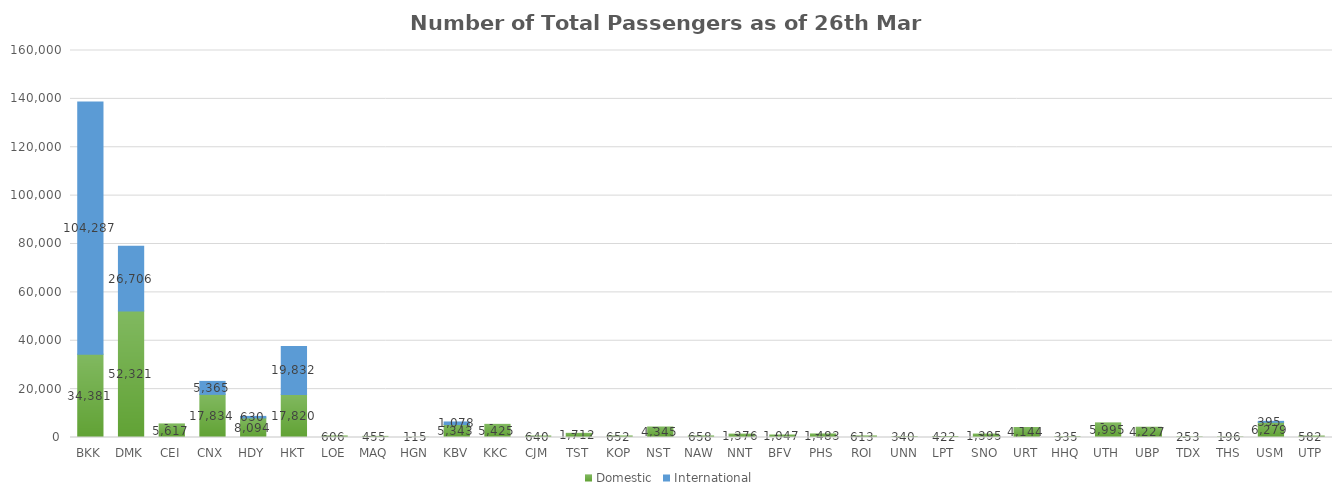
| Category | Domestic | International |
|---|---|---|
| BKK | 34381 | 104287 |
| DMK | 52321 | 26706 |
| CEI | 5617 | 0 |
| CNX | 17834 | 5365 |
| HDY | 8094 | 630 |
| HKT | 17820 | 19832 |
| LOE | 606 | 0 |
| MAQ | 455 | 0 |
| HGN | 115 | 0 |
| KBV | 5343 | 1078 |
| KKC | 5425 | 0 |
| CJM | 640 | 0 |
| TST | 1712 | 0 |
| KOP | 652 | 0 |
| NST | 4345 | 0 |
| NAW | 658 | 0 |
| NNT | 1376 | 0 |
| BFV | 1047 | 0 |
| PHS | 1483 | 0 |
| ROI | 613 | 0 |
| UNN | 340 | 0 |
| LPT | 422 | 0 |
| SNO | 1395 | 0 |
| URT | 4144 | 0 |
| HHQ | 335 | 0 |
| UTH | 5995 | 0 |
| UBP | 4227 | 0 |
| TDX | 253 | 0 |
| THS | 196 | 0 |
| USM | 6279 | 395 |
| UTP | 582 | 0 |